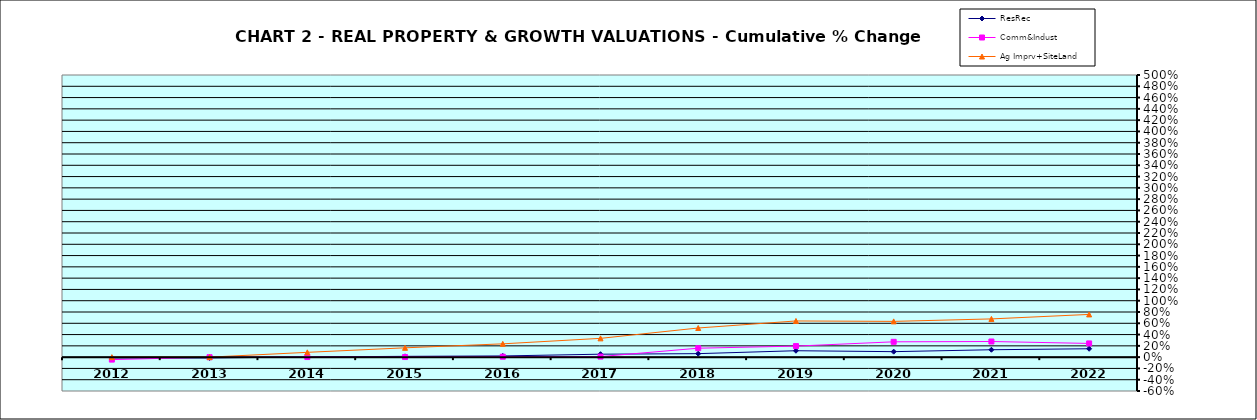
| Category | ResRec | Comm&Indust | Ag Imprv+SiteLand |
|---|---|---|---|
| 2012.0 | -0.015 | -0.044 | 0 |
| 2013.0 | -0.015 | -0.001 | 0 |
| 2014.0 | 0.003 | 0.002 | 0.085 |
| 2015.0 | 0.014 | 0.002 | 0.165 |
| 2016.0 | 0.021 | 0.008 | 0.236 |
| 2017.0 | 0.052 | 0.01 | 0.333 |
| 2018.0 | 0.062 | 0.158 | 0.517 |
| 2019.0 | 0.114 | 0.196 | 0.641 |
| 2020.0 | 0.097 | 0.272 | 0.634 |
| 2021.0 | 0.131 | 0.277 | 0.678 |
| 2022.0 | 0.149 | 0.243 | 0.757 |